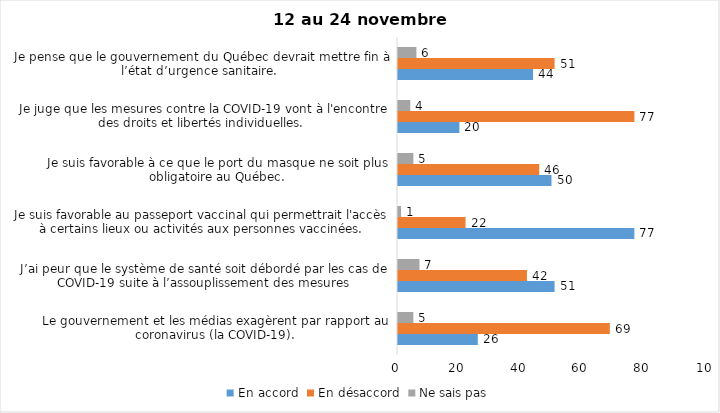
| Category | En accord | En désaccord | Ne sais pas |
|---|---|---|---|
| Le gouvernement et les médias exagèrent par rapport au coronavirus (la COVID-19). | 26 | 69 | 5 |
| J’ai peur que le système de santé soit débordé par les cas de COVID-19 suite à l’assouplissement des mesures | 51 | 42 | 7 |
| Je suis favorable au passeport vaccinal qui permettrait l'accès à certains lieux ou activités aux personnes vaccinées. | 77 | 22 | 1 |
| Je suis favorable à ce que le port du masque ne soit plus obligatoire au Québec. | 50 | 46 | 5 |
| Je juge que les mesures contre la COVID-19 vont à l'encontre des droits et libertés individuelles.  | 20 | 77 | 4 |
| Je pense que le gouvernement du Québec devrait mettre fin à l’état d’urgence sanitaire.  | 44 | 51 | 6 |